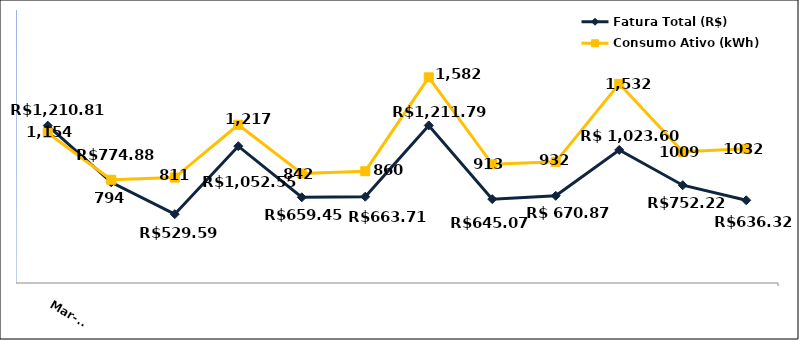
| Category | Fatura Total (R$) |
|---|---|
| 2022-03-01 | 1210.81 |
| 2022-04-01 | 774.88 |
| 2022-05-01 | 529.59 |
| 2022-06-01 | 1052.55 |
| 2022-07-01 | 659.45 |
| 2022-08-01 | 663.71 |
| 2022-09-01 | 1211.79 |
| 2022-10-01 | 645.07 |
| 2022-11-01 | 670.87 |
| 2022-12-01 | 1023.6 |
| 2023-01-01 | 752.22 |
| 2023-02-01 | 636.32 |